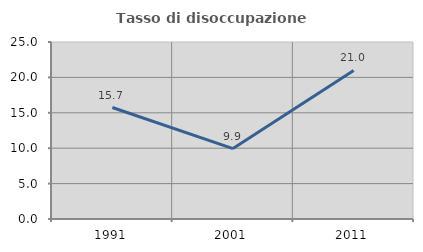
| Category | Tasso di disoccupazione giovanile  |
|---|---|
| 1991.0 | 15.748 |
| 2001.0 | 9.945 |
| 2011.0 | 20.988 |